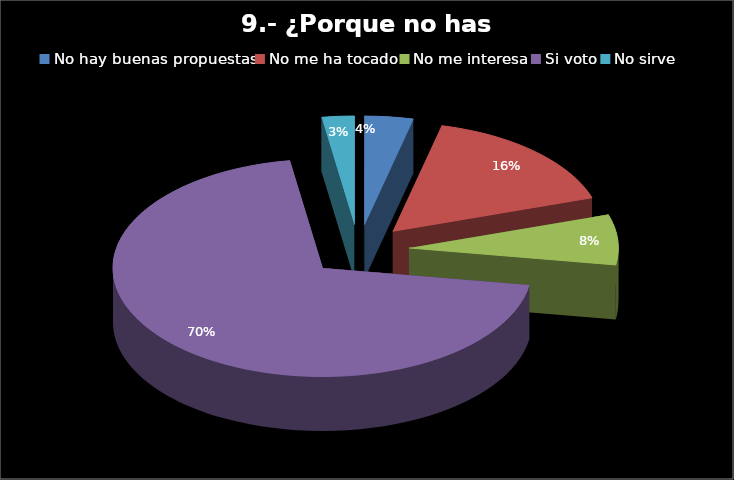
| Category | Series 0 |
|---|---|
| No hay buenas propuestas | 3 |
| No me ha tocado | 13 |
| No me interesa | 6 |
| Si voto | 56 |
| No sirve | 2 |